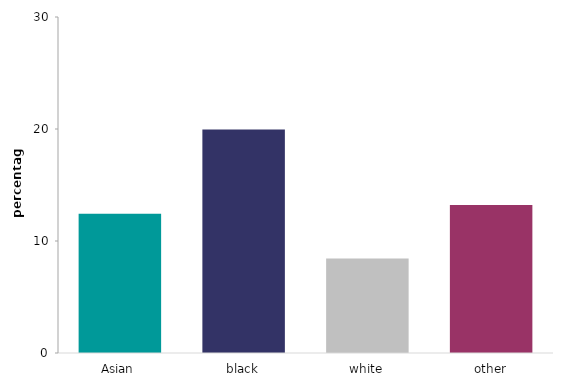
| Category | treated worse than other races |
|---|---|
| Asian | 12.438 |
| black | 19.962 |
| white | 8.429 |
| other | 13.215 |